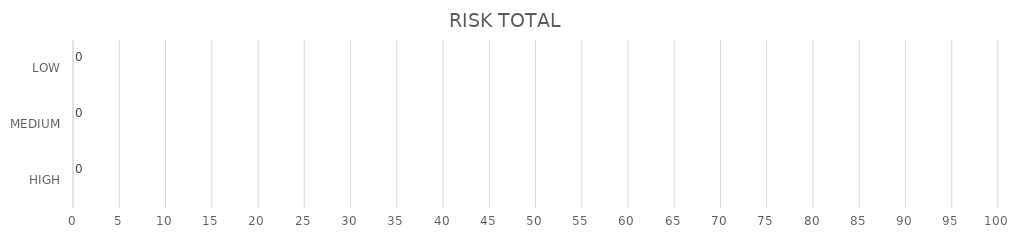
| Category | Series 1 | Series 0 |
|---|---|---|
| HIGH | 0 | 0 |
| MEDIUM | 0 | 0 |
| LOW | 0 | 0 |